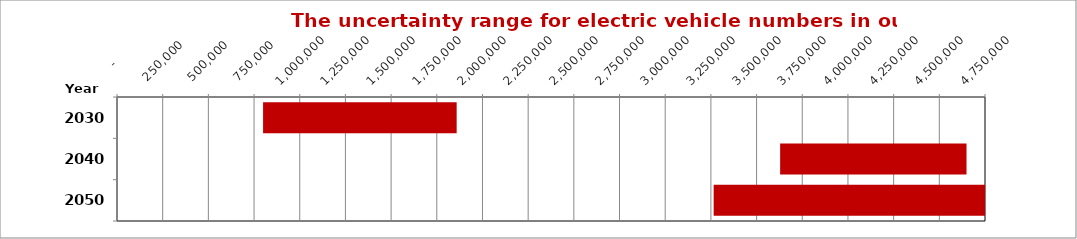
| Category | Min | Inc |
|---|---|---|
| 2030.0 | 799409 | 1059335 |
| 2040.0 | 3628954 | 1019890 |
| 2050.0 | 3265158 | 1738486 |